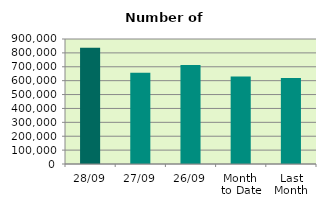
| Category | Series 0 |
|---|---|
| 28/09 | 836570 |
| 27/09 | 656696 |
| 26/09 | 713548 |
| Month 
to Date | 630351.8 |
| Last
Month | 618945.565 |